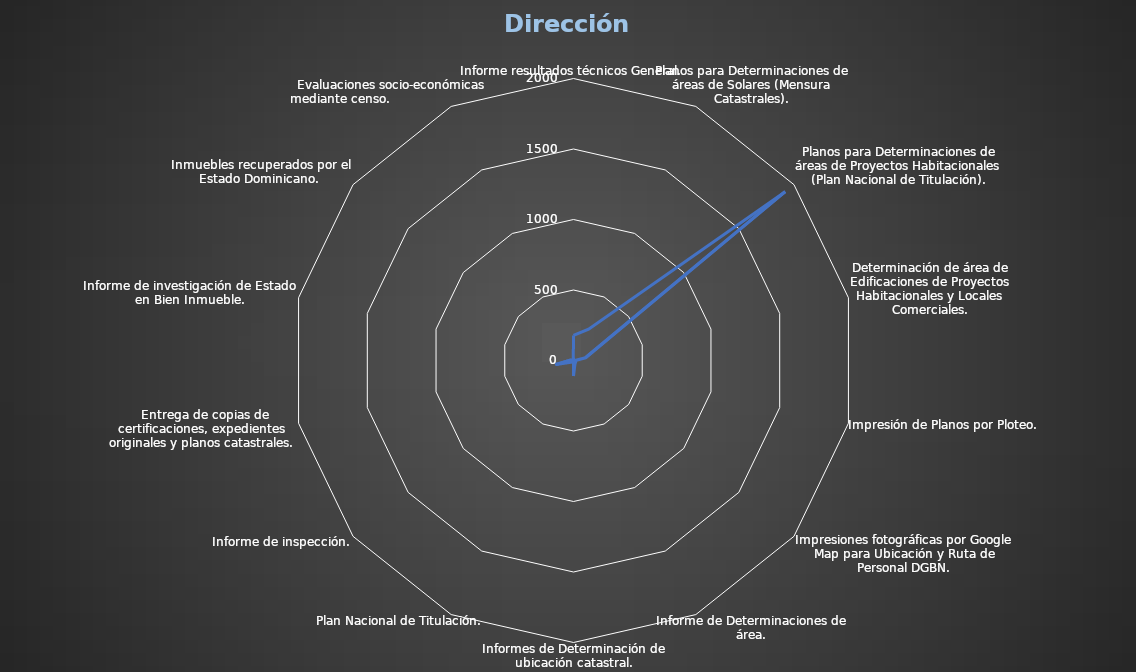
| Category | Series 0 |
|---|---|
| Informe resultados técnicos General. | 178 |
| Planos para Determinaciones de áreas de Solares (Mensura Catastrales). | 247 |
| Planos para Determinaciones de áreas de Proyectos Habitacionales (Plan Nacional de Titulación). | 1920 |
| Determinación de área de Edificaciones de Proyectos Habitacionales y Locales Comerciales. | 87 |
| Impresión de Planos por Ploteo. | 6 |
| Impresiones fotográficas por Google Map para Ubicación y Ruta de Personal DGBN. | 19 |
| Informe de Determinaciones de área. | 25 |
| Informes de Determinación de ubicación catastral. | 110 |
| Plan Nacional de Titulación. | 0 |
| Informe de inspección. | 19 |
|  Entrega de copias de certificaciones, expedientes originales y planos catastrales. | 131 |
| Informe de investigación de Estado en Bien Inmueble. | 18 |
|  Inmuebles recuperados por el Estado Dominicano. | 2 |
| Evaluaciones socio-económicas mediante censo.                            | 6 |